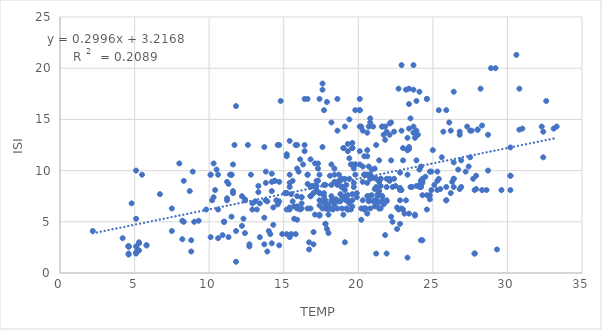
| Category | ISI |
|---|---|
| 8.2 | 5.1 |
| 18.0 | 6.7 |
| 14.6 | 6.7 |
| 8.3 | 9 |
| 11.4 | 9.6 |
| 22.2 | 14.7 |
| 24.1 | 8.5 |
| 8.0 | 10.7 |
| 13.1 | 7 |
| 22.8 | 7.1 |
| 17.8 | 7.1 |
| 19.3 | 12.6 |
| 17.0 | 2.8 |
| 21.3 | 7 |
| 26.4 | 9.2 |
| 22.9 | 13.9 |
| 15.1 | 7.8 |
| 16.7 | 3 |
| 15.9 | 6.3 |
| 9.3 | 5.1 |
| 18.3 | 7 |
| 19.1 | 9.2 |
| 21.0 | 9.3 |
| 19.5 | 6.2 |
| 23.7 | 20.3 |
| 16.3 | 10.6 |
| 19.0 | 12.2 |
| 19.4 | 7 |
| 30.2 | 8.1 |
| 22.8 | 8.1 |
| 25.4 | 15.9 |
| 11.2 | 7.1 |
| 20.6 | 5.8 |
| 17.7 | 7.8 |
| 21.2 | 9.2 |
| 18.2 | 6.3 |
| 21.7 | 6.7 |
| 11.3 | 8.7 |
| 17.8 | 6.7 |
| 14.1 | 3.8 |
| 23.3 | 1.5 |
| 18.4 | 8.9 |
| 16.6 | 17 |
| 19.6 | 7.1 |
| 12.9 | 6.2 |
| 25.9 | 15.9 |
| 14.7 | 7 |
| 23.0 | 11 |
| 11.8 | 4.1 |
| 11.0 | 5 |
| 20.8 | 9.2 |
| 21.5 | 6.3 |
| 20.4 | 9.6 |
| 20.4 | 9.6 |
| 17.6 | 6.3 |
| 27.7 | 9.2 |
| 17.8 | 6.3 |
| 13.8 | 8.8 |
| 13.9 | 2.1 |
| 12.3 | 5.3 |
| 11.5 | 9.6 |
| 5.5 | 9.6 |
| 18.8 | 7.7 |
| 20.8 | 6.3 |
| 23.1 | 5.8 |
| 18.6 | 6.3 |
| 23.0 | 12.2 |
| 19.6 | 12.2 |
| 19.6 | 12.2 |
| 17.2 | 9 |
| 15.8 | 12.5 |
| 17.7 | 15.9 |
| 15.6 | 9 |
| 17.3 | 9 |
| 27.6 | 13.9 |
| 6.7 | 7.7 |
| 15.7 | 5.3 |
| 8.3 | 5 |
| 14.7 | 12.5 |
| 21.6 | 7 |
| 19.5 | 10.6 |
| 17.9 | 6.3 |
| 18.6 | 17 |
| 16.6 | 9.6 |
| 20.2 | 6.3 |
| 21.5 | 9.2 |
| 25.4 | 9.2 |
| 22.4 | 9.2 |
| 25.3 | 8.1 |
| 17.4 | 7.8 |
| 14.7 | 8.9 |
| 17.4 | 7.8 |
| 20.8 | 14.7 |
| 18.2 | 10.6 |
| 23.4 | 5.8 |
| 17.8 | 4.8 |
| 12.7 | 2.6 |
| 17.4 | 5.7 |
| 11.6 | 10.6 |
| 19.8 | 10.6 |
| 19.8 | 10.6 |
| 14.4 | 9 |
| 20.1 | 17 |
| 24.1 | 8.6 |
| 5.3 | 2.9 |
| 12.7 | 2.8 |
| 18.2 | 7.5 |
| 21.4 | 6.3 |
| 20.3 | 7.1 |
| 17.4 | 7.1 |
| 13.7 | 2.8 |
| 18.8 | 9 |
| 22.8 | 4.8 |
| 18.9 | 9.2 |
| 15.8 | 3.8 |
| 15.5 | 3.8 |
| 11.6 | 7.8 |
| 15.2 | 7.8 |
| 10.6 | 6.2 |
| 19.6 | 7.7 |
| 10.3 | 10.7 |
| 17.1 | 10.7 |
| 22.5 | 8.5 |
| 17.9 | 4.3 |
| 19.8 | 15.9 |
| 20.6 | 8.8 |
| 9.0 | 5 |
| 17.2 | 8.1 |
| 15.9 | 5.2 |
| 15.4 | 8.8 |
| 15.4 | 3.5 |
| 14.0 | 4.1 |
| 10.6 | 9.6 |
| 17.6 | 17.9 |
| 14.9 | 3.8 |
| 17.6 | 18.5 |
| 17.2 | 8.5 |
| 15.6 | 7 |
| 18.0 | 3.9 |
| 21.7 | 7 |
| 21.9 | 7 |
| 23.3 | 13.2 |
| 21.2 | 12.5 |
| 16.6 | 8.7 |
| 23.8 | 13.2 |
| 27.4 | 10.4 |
| 13.2 | 6.2 |
| 24.2 | 3.2 |
| 17.4 | 17 |
| 23.7 | 17.9 |
| 23.2 | 7.1 |
| 24.8 | 7.2 |
| 24.6 | 6.2 |
| 20.1 | 15.9 |
| 29.6 | 8.1 |
| 16.4 | 17 |
| 28.6 | 8.1 |
| 18.4 | 9.6 |
| 20.5 | 9.6 |
| 19.0 | 12.2 |
| 16.1 | 6.2 |
| 20.3 | 10.4 |
| 15.2 | 7.8 |
| 17.8 | 8.6 |
| 17.8 | 4.8 |
| 5.3 | 3 |
| 16.6 | 9.6 |
| 23.4 | 16.5 |
| 14.6 | 12.5 |
| 20.7 | 10.4 |
| 21.9 | 9.2 |
| 17.4 | 6.6 |
| 20.1 | 10.6 |
| 17.7 | 7 |
| 14.2 | 8.9 |
| 20.3 | 8.9 |
| 5.8 | 2.7 |
| 19.2 | 6.3 |
| 18.3 | 6.2 |
| 14.4 | 9 |
| 23.9 | 8.5 |
| 19.1 | 3 |
| 12.4 | 3.9 |
| 16.8 | 11.1 |
| 20.8 | 15.1 |
| 17.6 | 7 |
| 11.5 | 9.6 |
| 21.0 | 7 |
| 13.3 | 7.9 |
| 11.5 | 5.5 |
| 11.7 | 12.5 |
| 24.2 | 10.4 |
| 24.6 | 17 |
| 24.3 | 9.2 |
| 24.6 | 17 |
| 23.5 | 15.1 |
| 5.8 | 2.7 |
| 21.5 | 9.2 |
| 13.9 | 7 |
| 22.6 | 4.3 |
| 21.6 | 7 |
| 12.4 | 7.2 |
| 8.8 | 2.1 |
| 20.2 | 5.2 |
| 15.1 | 7.8 |
| 22.1 | 9.2 |
| 22.9 | 20.3 |
| 20.7 | 7 |
| 19.6 | 12.2 |
| 23.2 | 17.9 |
| 18.4 | 6.7 |
| 5.1 | 10 |
| 20.1 | 15.9 |
| 11.0 | 5 |
| 17.0 | 7.8 |
| 17.0 | 7.8 |
| 16.9 | 8.5 |
| 12.4 | 7.1 |
| 19.4 | 9.2 |
| 15.2 | 6.2 |
| 16.2 | 6.3 |
| 18.6 | 13.9 |
| 11.0 | 5 |
| 13.4 | 6.8 |
| 15.4 | 6.2 |
| 22.9 | 8.1 |
| 16.1 | 11.1 |
| 20.1 | 11.9 |
| 28.3 | 8.1 |
| 16.4 | 11.9 |
| 26.4 | 9.2 |
| 27.8 | 8.1 |
| 18.7 | 7 |
| 24.3 | 3.2 |
| 17.7 | 8.6 |
| 19.6 | 10.6 |
| 18.2 | 8.6 |
| 18.8 | 7 |
| 25.1 | 8.6 |
| 13.4 | 3.5 |
| 15.2 | 3.8 |
| 16.7 | 2.3 |
| 15.4 | 12.9 |
| 21.9 | 13.8 |
| 22.4 | 13.8 |
| 26.8 | 13.8 |
| 25.7 | 13.8 |
| 20.7 | 9.6 |
| 28.7 | 13.5 |
| 21.7 | 13.5 |
| 26.8 | 13.5 |
| 24.0 | 13.5 |
| 22.1 | 13.5 |
| 21.4 | 8 |
| 18.9 | 6.3 |
| 22.3 | 5 |
| 23.9 | 11 |
| 21.4 | 11 |
| 20.6 | 13.7 |
| 23.7 | 13.7 |
| 28.3 | 14.4 |
| 11.2 | 8.9 |
| 21.4 | 8.9 |
| 19.3 | 7.1 |
| 21.8 | 13 |
| 22.1 | 14.6 |
| 19.4 | 11.2 |
| 23.7 | 14.3 |
| 21.0 | 14.3 |
| 19.1 | 14.3 |
| 21.8 | 14.3 |
| 20.1 | 14.3 |
| 20.2 | 14.3 |
| 4.8 | 6.8 |
| 5.1 | 5.3 |
| 5.1 | 2 |
| 4.6 | 2.6 |
| 4.6 | 2.6 |
| 4.6 | 2.6 |
| 4.6 | 2.6 |
| 2.2 | 4.1 |
| 5.1 | 2.6 |
| 4.2 | 3.4 |
| 8.8 | 3.2 |
| 7.5 | 6.3 |
| 23.4 | 12.3 |
| 12.6 | 12.5 |
| 22.1 | 9 |
| 24.2 | 9 |
| 24.3 | 9 |
| 18.7 | 9 |
| 25.3 | 9 |
| 22.9 | 6.3 |
| 26.9 | 11 |
| 17.1 | 8.5 |
| 22.2 | 11 |
| 14.3 | 6.4 |
| 15.4 | 6.4 |
| 19.6 | 12.7 |
| 10.6 | 3.4 |
| 20.7 | 7.5 |
| 19.1 | 7.5 |
| 19.2 | 7.1 |
| 19.2 | 7.1 |
| 11.3 | 3.5 |
| 19.0 | 5.7 |
| 17.1 | 5.7 |
| 23.8 | 5.7 |
| 16.0 | 9.9 |
| 24.9 | 9.9 |
| 25.3 | 9.9 |
| 24.8 | 9.9 |
| 12.2 | 4.6 |
| 24.3 | 8.8 |
| 19.7 | 8.8 |
| 18.5 | 7.2 |
| 18.6 | 8.6 |
| 19.2 | 8.6 |
| 21.6 | 7.5 |
| 21.6 | 7.5 |
| 18.9 | 7.5 |
| 16.8 | 7.5 |
| 16.8 | 7.5 |
| 12.9 | 6.8 |
| 13.7 | 5.4 |
| 24.2 | 8.4 |
| 24.1 | 8.4 |
| 21.2 | 8.4 |
| 19.7 | 8.4 |
| 23.5 | 8.4 |
| 24.2 | 8.4 |
| 21.5 | 8.5 |
| 17.1 | 8.5 |
| 18.1 | 9.5 |
| 18.0 | 6.2 |
| 9.8 | 6.2 |
| 19.3 | 6.2 |
| 23.0 | 6.2 |
| 22.7 | 6.2 |
| 20.4 | 6.2 |
| 19.3 | 6.2 |
| 15.7 | 6.5 |
| 20.6 | 7.5 |
| 15.9 | 7.5 |
| 12.2 | 7.5 |
| 16.8 | 7.5 |
| 21.3 | 7.5 |
| 10.1 | 9.6 |
| 17.4 | 9.6 |
| 12.8 | 9.6 |
| 10.1 | 9.6 |
| 15.4 | 9.6 |
| 20.6 | 9.6 |
| 19.8 | 9.6 |
| 18.7 | 9.6 |
| 20.8 | 9.6 |
| 20.8 | 9.6 |
| 15.9 | 10.2 |
| 19.7 | 10.2 |
| 21.1 | 10.2 |
| 18.4 | 10.2 |
| 17.3 | 10.2 |
| 15.2 | 11.6 |
| 15.9 | 6.5 |
| 21.1 | 6.5 |
| 19.6 | 6.5 |
| 15.9 | 12.5 |
| 16.4 | 12.5 |
| 16.8 | 8.4 |
| 13.8 | 7.1 |
| 13.8 | 7.1 |
| 14.2 | 8 |
| 10.4 | 8.1 |
| 20.3 | 13.9 |
| 10.3 | 7.4 |
| 15.4 | 8.4 |
| 21.1 | 8.2 |
| 21.9 | 8.4 |
| 8.7 | 8 |
| 5.2 | 2.3 |
| 19.3 | 11.9 |
| 16.2 | 6.8 |
| 28.2 | 18 |
| 20.5 | 6.3 |
| 21.3 | 7.7 |
| 20.9 | 7.6 |
| 20.6 | 11.4 |
| 11.6 | 8 |
| 23.3 | 12 |
| 23.3 | 12 |
| 7.5 | 4.1 |
| 20.7 | 7.2 |
| 21.9 | 7.1 |
| 15.2 | 11.4 |
| 5.3 | 2.2 |
| 10.1 | 3.5 |
| 20.4 | 11.4 |
| 24.3 | 7.6 |
| 25.9 | 8.4 |
| 28.0 | 14 |
| 28.0 | 14 |
| 22.8 | 8.3 |
| 25.0 | 12 |
| 21.3 | 6.8 |
| 21.8 | 3.7 |
| 27.9 | 9.5 |
| 17.0 | 4 |
| 14.2 | 2.9 |
| 19.9 | 7.4 |
| 23.4 | 12.1 |
| 14.7 | 2.7 |
| 8.2 | 3.3 |
| 22.8 | 9.8 |
| 26.4 | 8.4 |
| 24.1 | 10.1 |
| 27.5 | 13.9 |
| 26.3 | 8.9 |
| 13.8 | 9.9 |
| 24.9 | 8.1 |
| 24.8 | 7.6 |
| 26.2 | 7.8 |
| 30.8 | 18 |
| 29.3 | 2.3 |
| 22.3 | 8.4 |
| 26.9 | 8.4 |
| 20.4 | 6.3 |
| 20.4 | 6.3 |
| 27.9 | 8.2 |
| 26.2 | 13.9 |
| 24.6 | 7.6 |
| 19.4 | 6.8 |
| 23.3 | 9.6 |
| 23.9 | 13.9 |
| 20.9 | 10.1 |
| 22.2 | 5.5 |
| 23.8 | 5.6 |
| 26.8 | 8.2 |
| 14.2 | 9.7 |
| 23.6 | 8.4 |
| 19.1 | 7.2 |
| 16.2 | 7.4 |
| 25.5 | 8.2 |
| 10.9 | 3.7 |
| 14.8 | 16.8 |
| 16.2 | 7.4 |
| 17.3 | 10.7 |
| 19.1 | 8.1 |
| 8.9 | 9.9 |
| 10.5 | 10.1 |
| 19.3 | 7.6 |
| 23.4 | 18 |
| 11.8 | 16.3 |
| 17.7 | 7.5 |
| 17.4 | 5.6 |
| 16.8 | 6.3 |
| 17.9 | 16.7 |
| 16.6 | 6.3 |
| 19.9 | 7.8 |
| 18.9 | 8.4 |
| 15.5 | 7.7 |
| 18.9 | 8.4 |
| 18.9 | 8.4 |
| 14.5 | 7.1 |
| 4.6 | 1.9 |
| 5.1 | 1.9 |
| 4.6 | 1.8 |
| 10.2 | 7.1 |
| 11.2 | 7.3 |
| 13.3 | 8.5 |
| 13.7 | 12.3 |
| 17.6 | 12.3 |
| 18.0 | 5.7 |
| 14.3 | 4.7 |
| 24.5 | 9.4 |
| 26.4 | 10.8 |
| 22.7 | 18 |
| 27.2 | 9.9 |
| 26.1 | 14.7 |
| 18.2 | 14.7 |
| 22.6 | 6.4 |
| 30.2 | 9.5 |
| 30.2 | 9.5 |
| 23.4 | 14.1 |
| 31.0 | 14.1 |
| 33.1 | 14.1 |
| 30.6 | 21.3 |
| 24.1 | 17.7 |
| 26.4 | 17.7 |
| 19.4 | 15 |
| 20.6 | 12 |
| 28.7 | 10 |
| 32.4 | 13.8 |
| 32.4 | 11.3 |
| 27.5 | 11.3 |
| 30.8 | 14 |
| 23.9 | 16.8 |
| 32.6 | 16.8 |
| 32.3 | 14.3 |
| 33.3 | 14.3 |
| 27.3 | 14.3 |
| 21.6 | 14.3 |
| 21.6 | 14.3 |
| 20.7 | 14.3 |
| 29.2 | 20 |
| 28.9 | 20 |
| 26.7 | 10.1 |
| 18.5 | 7.1 |
| 25.9 | 7.1 |
| 25.9 | 7.1 |
| 21.1 | 7.1 |
| 18.2 | 7.1 |
| 27.8 | 1.9 |
| 27.8 | 1.9 |
| 21.9 | 1.9 |
| 21.2 | 1.9 |
| 25.6 | 11.3 |
| 11.8 | 1.1 |
| 30.2 | 12.26 |